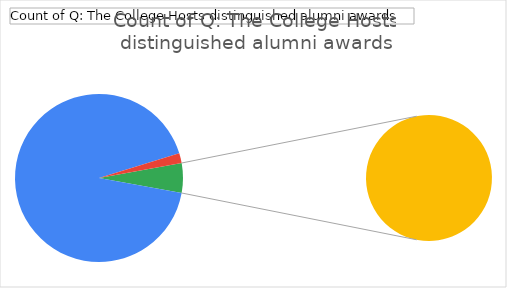
| Category | Total |
|---|---|
| Agree | 97 |
| Disagree | 2 |
| Neutral | 6 |